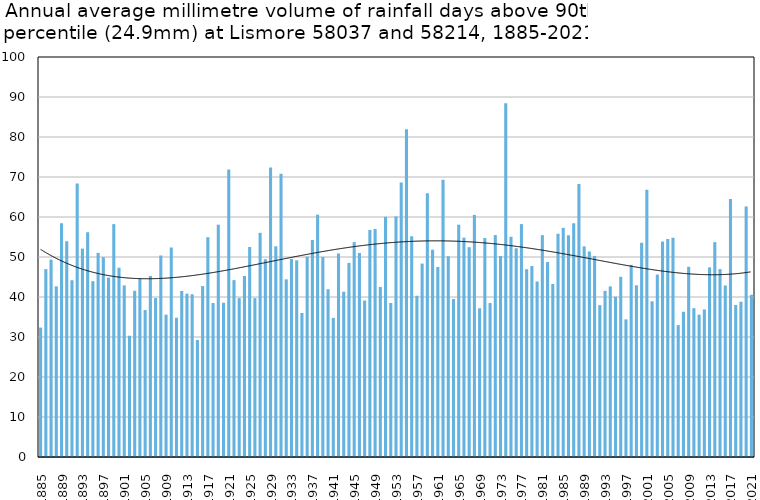
| Category | Annual average mm in days above 90th percentile |
|---|---|
| 1885 | 32.362 |
| 1886 | 46.958 |
| 1887 | 49.332 |
| 1888 | 42.667 |
| 1889 | 58.465 |
| 1890 | 53.941 |
| 1891 | 44.19 |
| 1892 | 68.353 |
| 1893 | 52.1 |
| 1894 | 56.188 |
| 1895 | 43.95 |
| 1896 | 51.033 |
| 1897 | 49.93 |
| 1898 | 44.845 |
| 1899 | 58.214 |
| 1900 | 47.32 |
| 1901 | 42.9 |
| 1902 | 30.317 |
| 1903 | 41.55 |
| 1904 | 44.623 |
| 1905 | 36.743 |
| 1906 | 45.281 |
| 1907 | 39.738 |
| 1908 | 50.385 |
| 1909 | 35.58 |
| 1910 | 52.381 |
| 1911 | 34.821 |
| 1912 | 41.5 |
| 1913 | 40.838 |
| 1914 | 40.68 |
| 1915 | 29.24 |
| 1916 | 42.727 |
| 1917 | 54.945 |
| 1918 | 38.5 |
| 1919 | 58.08 |
| 1920 | 38.543 |
| 1921 | 71.847 |
| 1922 | 44.221 |
| 1923 | 39.721 |
| 1924 | 45.267 |
| 1925 | 52.497 |
| 1926 | 39.717 |
| 1927 | 56.05 |
| 1928 | 49.447 |
| 1929 | 72.383 |
| 1930 | 52.688 |
| 1931 | 70.794 |
| 1932 | 44.417 |
| 1933 | 49.495 |
| 1934 | 49.171 |
| 1935 | 35.993 |
| 1936 | 50.088 |
| 1937 | 54.237 |
| 1938 | 60.586 |
| 1939 | 49.992 |
| 1940 | 41.95 |
| 1941 | 34.778 |
| 1942 | 50.892 |
| 1943 | 41.321 |
| 1944 | 48.533 |
| 1945 | 53.713 |
| 1946 | 51.013 |
| 1947 | 39.118 |
| 1948 | 56.767 |
| 1949 | 57.01 |
| 1950 | 42.512 |
| 1951 | 60.033 |
| 1952 | 38.5 |
| 1953 | 60.143 |
| 1954 | 68.594 |
| 1955 | 81.931 |
| 1956 | 55.184 |
| 1957 | 40.312 |
| 1958 | 48.358 |
| 1959 | 65.926 |
| 1960 | 51.825 |
| 1961 | 47.492 |
| 1962 | 69.333 |
| 1963 | 50.188 |
| 1964 | 39.487 |
| 1965 | 58.08 |
| 1966 | 54.838 |
| 1967 | 52.45 |
| 1968 | 60.533 |
| 1969 | 37.183 |
| 1970 | 54.74 |
| 1971 | 38.483 |
| 1972 | 55.482 |
| 1973 | 50.238 |
| 1974 | 88.456 |
| 1975 | 55.053 |
| 1976 | 52.188 |
| 1977 | 58.222 |
| 1978 | 46.957 |
| 1979 | 47.747 |
| 1980 | 43.88 |
| 1981 | 55.457 |
| 1982 | 48.743 |
| 1983 | 43.245 |
| 1984 | 55.82 |
| 1985 | 57.291 |
| 1986 | 55.467 |
| 1987 | 58.431 |
| 1988 | 68.244 |
| 1989 | 52.66 |
| 1990 | 51.371 |
| 1991 | 50.273 |
| 1992 | 37.971 |
| 1993 | 41.543 |
| 1994 | 42.662 |
| 1995 | 40.036 |
| 1996 | 45.05 |
| 1997 | 34.4 |
| 1998 | 48.029 |
| 1999 | 42.933 |
| 2000 | 53.55 |
| 2001 | 66.8 |
| 2002 | 38.922 |
| 2003 | 45.618 |
| 2004 | 53.86 |
| 2005 | 54.5 |
| 2006 | 54.817 |
| 2007 | 32.975 |
| 2008 | 36.318 |
| 2009 | 47.557 |
| 2010 | 37.2 |
| 2011 | 35.585 |
| 2012 | 36.888 |
| 2013 | 47.4 |
| 2014 | 53.72 |
| 2015 | 46.985 |
| 2016 | 42.875 |
| 2017 | 64.509 |
| 2018 | 38 |
| 2019 | 38.82 |
| 2020 | 62.633 |
| 2021 | 40.544 |